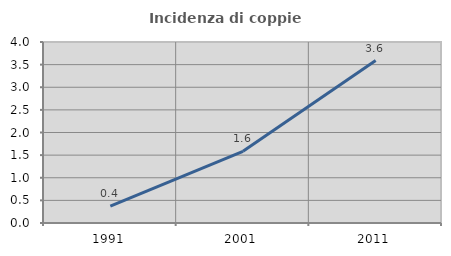
| Category | Incidenza di coppie miste |
|---|---|
| 1991.0 | 0.374 |
| 2001.0 | 1.585 |
| 2011.0 | 3.589 |